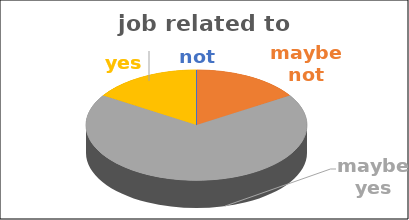
| Category | job related to studies | Series 1 | Series 2 | Series 3 | Series 4 |
|---|---|---|---|---|---|
| not | 0 |  |  |  |  |
| maybe not | 0.16 |  |  |  |  |
| maybe yes | 0.68 |  |  |  |  |
| yes | 0.16 |  |  |  |  |